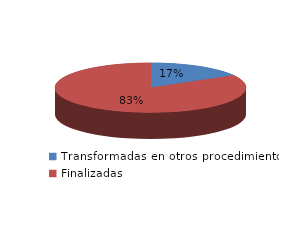
| Category | Series 0 |
|---|---|
| Transformadas en otros procedimientos | 1034 |
| Finalizadas | 5211 |